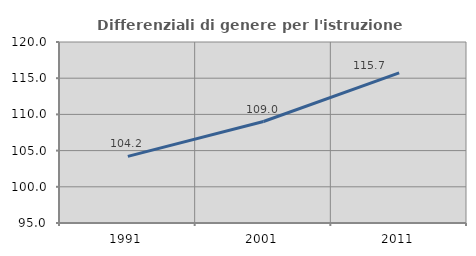
| Category | Differenziali di genere per l'istruzione superiore |
|---|---|
| 1991.0 | 104.197 |
| 2001.0 | 109.015 |
| 2011.0 | 115.747 |